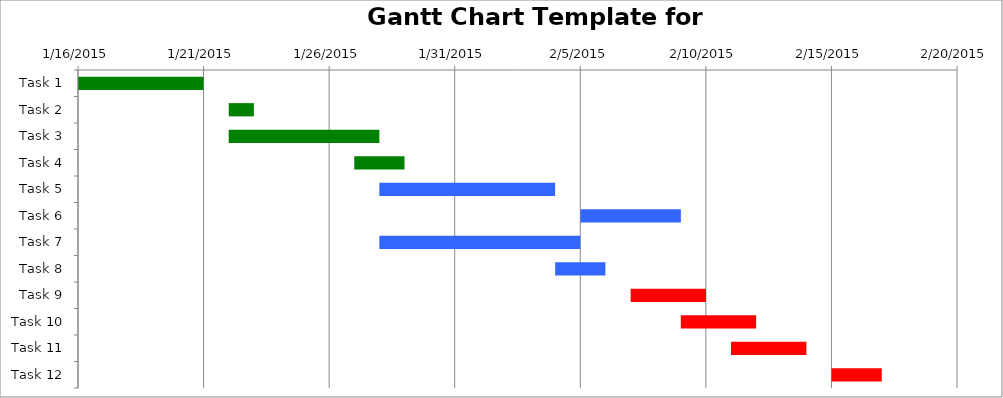
| Category | Start | Duration (days) |
|---|---|---|
| Task 1 | 1/16/15 | 5 |
| Task 2 | 1/22/15 | 1 |
| Task 3 | 1/22/15 | 6 |
| Task 4 | 1/27/15 | 2 |
| Task 5 | 1/28/15 | 7 |
| Task 6 | 2/5/15 | 4 |
| Task 7 | 1/28/15 | 8 |
| Task 8 | 2/4/15 | 2 |
| Task 9 | 2/7/15 | 3 |
| Task 10 | 2/9/15 | 3 |
| Task 11 | 2/11/15 | 3 |
| Task 12 | 2/15/15 | 2 |